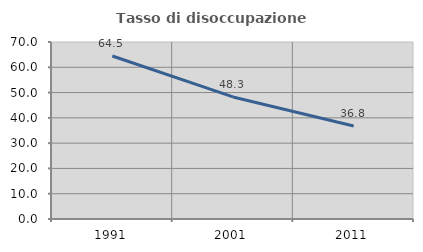
| Category | Tasso di disoccupazione giovanile  |
|---|---|
| 1991.0 | 64.46 |
| 2001.0 | 48.276 |
| 2011.0 | 36.8 |